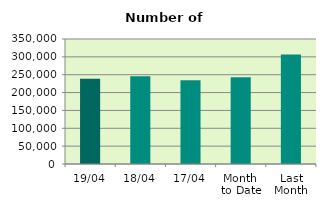
| Category | Series 0 |
|---|---|
| 19/04 | 238812 |
| 18/04 | 245594 |
| 17/04 | 234636 |
| Month 
to Date | 242976.4 |
| Last
Month | 306734.174 |